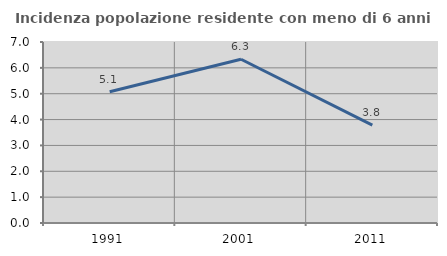
| Category | Incidenza popolazione residente con meno di 6 anni |
|---|---|
| 1991.0 | 5.079 |
| 2001.0 | 6.333 |
| 2011.0 | 3.783 |